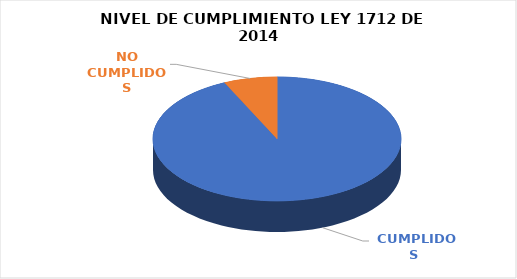
| Category | Series 0 |
|---|---|
|  CUMPLIDOS | 107 |
| NO CUMPLIDOS | 8 |